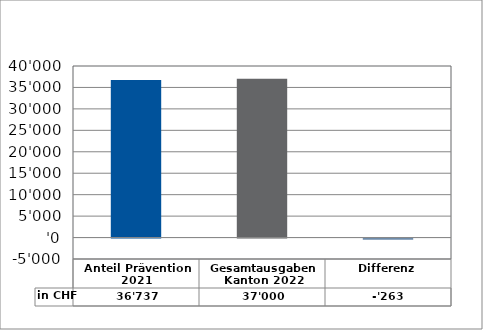
| Category | in CHF |
|---|---|
| Anteil Prävention 2021

 | 36737.1 |
| Gesamtausgaben Kanton 2022
 | 37000 |
| Differenz | -262.9 |